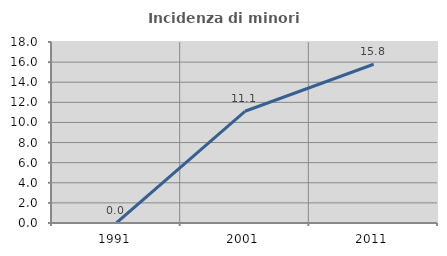
| Category | Incidenza di minori stranieri |
|---|---|
| 1991.0 | 0 |
| 2001.0 | 11.111 |
| 2011.0 | 15.789 |